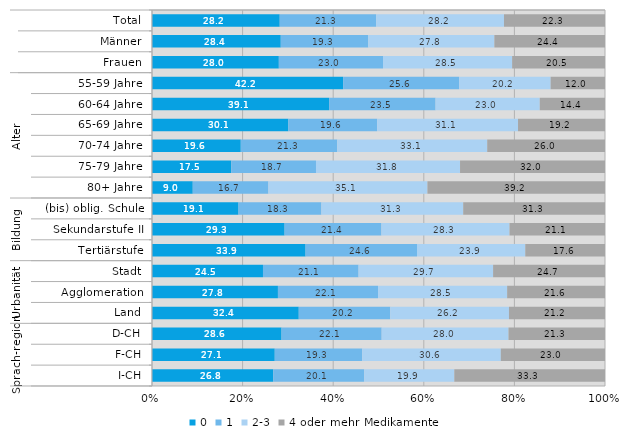
| Category | 0 | 1 | 2-3 | 4 oder mehr Medikamente |
|---|---|---|---|---|
| 0 | 28.2 | 21.3 | 28.2 | 22.3 |
| 1 | 28.4 | 19.3 | 27.8 | 24.4 |
| 2 | 28 | 23 | 28.5 | 20.5 |
| 3 | 42.2 | 25.6 | 20.2 | 12 |
| 4 | 39.1 | 23.5 | 23 | 14.4 |
| 5 | 30.1 | 19.6 | 31.1 | 19.2 |
| 6 | 19.6 | 21.3 | 33.1 | 26 |
| 7 | 17.5 | 18.7 | 31.8 | 32 |
| 8 | 9 | 16.7 | 35.1 | 39.2 |
| 9 | 19.1 | 18.3 | 31.3 | 31.3 |
| 10 | 29.3 | 21.4 | 28.3 | 21.1 |
| 11 | 33.9 | 24.6 | 23.9 | 17.6 |
| 12 | 24.5 | 21.1 | 29.7 | 24.7 |
| 13 | 27.8 | 22.1 | 28.5 | 21.6 |
| 14 | 32.4 | 20.2 | 26.2 | 21.2 |
| 15 | 28.6 | 22.1 | 28 | 21.3 |
| 16 | 27.1 | 19.3 | 30.6 | 23 |
| 17 | 26.8 | 20.1 | 19.9 | 33.3 |